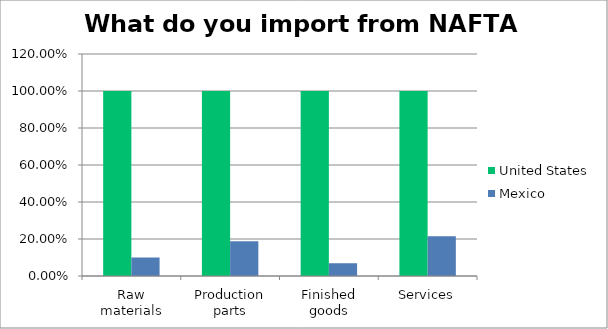
| Category | United States | Mexico |
|---|---|---|
| Raw materials | 1 | 0.1 |
| Production parts | 1 | 0.188 |
| Finished goods | 1 | 0.069 |
| Services | 1 | 0.214 |